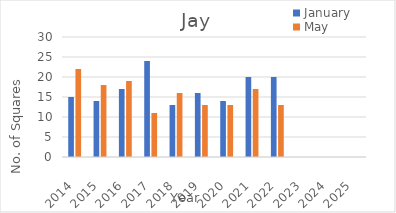
| Category | January | May |
|---|---|---|
| 2014.0 | 15 | 22 |
| 2015.0 | 14 | 18 |
| 2016.0 | 17 | 19 |
| 2017.0 | 24 | 11 |
| 2018.0 | 13 | 16 |
| 2019.0 | 16 | 13 |
| 2020.0 | 14 | 13 |
| 2021.0 | 20 | 17 |
| 2022.0 | 20 | 13 |
| 2023.0 | 0 | 0 |
| 2024.0 | 0 | 0 |
| 2025.0 | 0 | 0 |